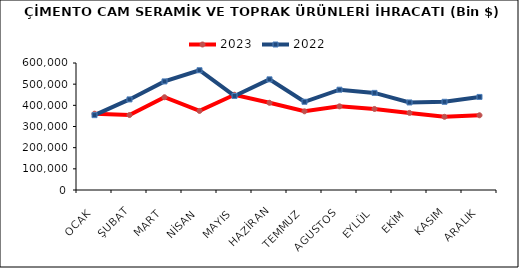
| Category | 2023 | 2022 |
|---|---|---|
| OCAK | 360462.289 | 353650.174 |
| ŞUBAT | 354125.736 | 428002.803 |
| MART | 438196.81 | 512983.46 |
| NİSAN | 373566.96 | 565756.647 |
| MAYIS | 450033.321 | 444256.317 |
| HAZİRAN | 412001.042 | 522785.365 |
| TEMMUZ | 371785.797 | 416802.239 |
| AGUSTOS | 395262.427 | 473859.945 |
| EYLÜL | 382864.373 | 458797.1 |
| EKİM | 364247.709 | 413607.051 |
| KASIM | 345804.685 | 416752.154 |
| ARALIK | 353025.411 | 439727.123 |